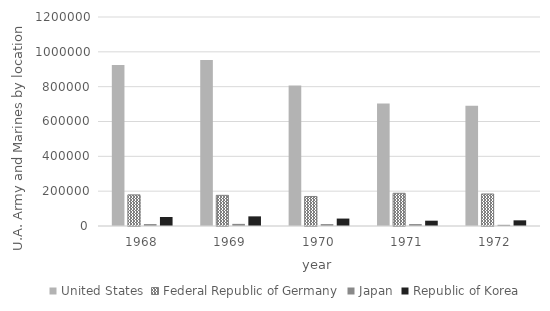
| Category | United States | Federal Republic of Germany | Japan | Republic of Korea |
|---|---|---|---|---|
| 1968.0 | 924589 | 178736 | 11089 | 51754 |
| 1969.0 | 952517 | 176077 | 12227 | 55348 |
| 1970.0 | 807196 | 169516 | 10986 | 42677 |
| 1971.0 | 703926 | 187806 | 11061 | 30496 |
| 1972.0 | 690956 | 183875 | 6735 | 32566 |